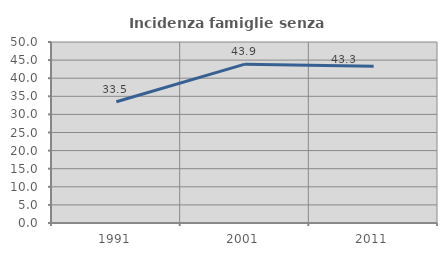
| Category | Incidenza famiglie senza nuclei |
|---|---|
| 1991.0 | 33.493 |
| 2001.0 | 43.882 |
| 2011.0 | 43.29 |